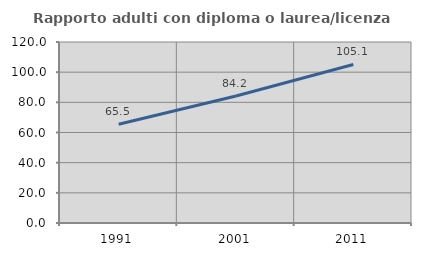
| Category | Rapporto adulti con diploma o laurea/licenza media  |
|---|---|
| 1991.0 | 65.482 |
| 2001.0 | 84.222 |
| 2011.0 | 105.096 |